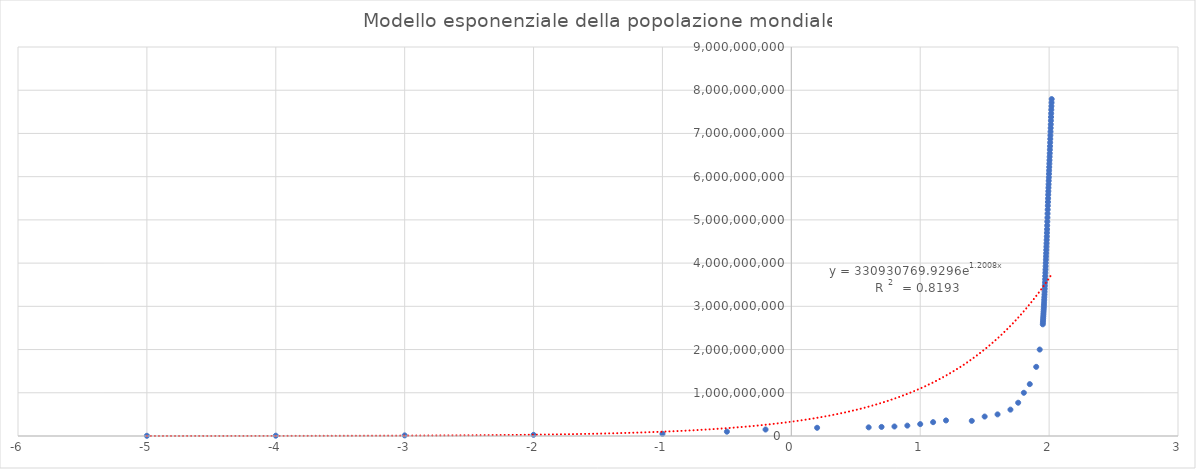
| Category | Series 0 |
|---|---|
| 2.02 | 7794798739 |
| 2.019 | 7713468100 |
| 2.018 | 7631091040 |
| 2.017 | 7547858925 |
| 2.016 | 7464022049 |
| 2.015 | 7379797139 |
| 2.014 | 7295290765 |
| 2.013 | 7210581976 |
| 2.012 | 7125828059 |
| 2.011 | 7041194301 |
| 2.01 | 6956823603 |
| 2.009 | 6872767093 |
| 2.008 | 6789088686 |
| 2.007 | 6705946610 |
| 2.006 | 6623517833 |
| 2.005 | 6541907027 |
| 2.004 | 6461159389 |
| 2.003 | 6381185114 |
| 2.002 | 6301773188 |
| 2.001 | 6222626606 |
| 2.0 | 6143493823 |
| 1.999 | 6064239055 |
| 1.998 | 5984793942 |
| 1.997 | 5905045788 |
| 1.996 | 5824891951 |
| 1.995 | 5744212979 |
| 1.994 | 5663150427 |
| 1.993 | 5581597546 |
| 1.992 | 5498919809 |
| 1.991 | 5414289444 |
| 1.99 | 5327231061 |
| 1.989 | 5237441558 |
| 1.988 | 5145426008 |
| 1.987 | 5052522147 |
| 1.986 | 4960567912 |
| 1.985 | 4870921740 |
| 1.984 | 4784011621 |
| 1.983 | 4699569304 |
| 1.982 | 4617386542 |
| 1.981 | 4536996762 |
| 1.98 | 4458003514 |
| 1.979 | 4380506100 |
| 1.978 | 4304533501 |
| 1.977 | 4229506060 |
| 1.976 | 4154666864 |
| 1.975 | 4079480606 |
| 1.974 | 4003794172 |
| 1.973 | 3927780238 |
| 1.972 | 3851650245 |
| 1.971 | 3775759617 |
| 1.97 | 3700437046 |
| 1.969 | 3625680627 |
| 1.968 | 3551599127 |
| 1.967 | 3478769962 |
| 1.966 | 3407922630 |
| 1.965 | 3339583597 |
| 1.964 | 3273978338 |
| 1.963 | 3211001009 |
| 1.962 | 3150420795 |
| 1.961 | 3091843507 |
| 1.96 | 3034949748 |
| 1.959 | 2979576185 |
| 1.958 | 2925686705 |
| 1.957 | 2873306090 |
| 1.956 | 2822443282 |
| 1.955 | 2773019936 |
| 1.954 | 2724846741 |
| 1.953 | 2677608960 |
| 1.952 | 2630861562 |
| 1.951 | 2584034261 |
| 1.927 | 2000000000 |
| 1.9 | 1600000000 |
| 1.85 | 1200000000 |
| 1.804 | 1000000000 |
| 1.76 | 770000000 |
| 1.7 | 610000000 |
| 1.6 | 500000000 |
| 1.5 | 450000000 |
| 1.4 | 350000000 |
| 1.2 | 360000000 |
| 1.1 | 320000000 |
| 1.0 | 275000000 |
| 0.9 | 240000000 |
| 0.8 | 220000000 |
| 0.7 | 210000000 |
| 0.6 | 200000000 |
| 0.2 | 190000000 |
| -0.2 | 150000000 |
| -0.5 | 100000000 |
| -1.0 | 50000000 |
| -2.0 | 27000000 |
| -3.0 | 14000000 |
| -4.0 | 7000000 |
| -5.0 | 5000000 |